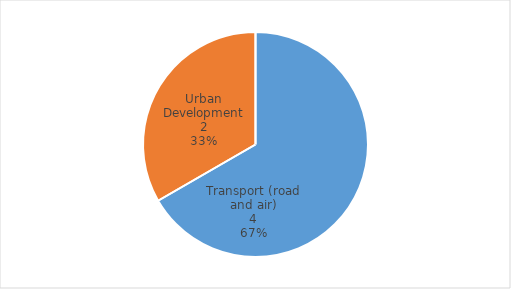
| Category | Series 0 |
|---|---|
| Transport (road and air) | 4 |
| Urban Development | 2 |